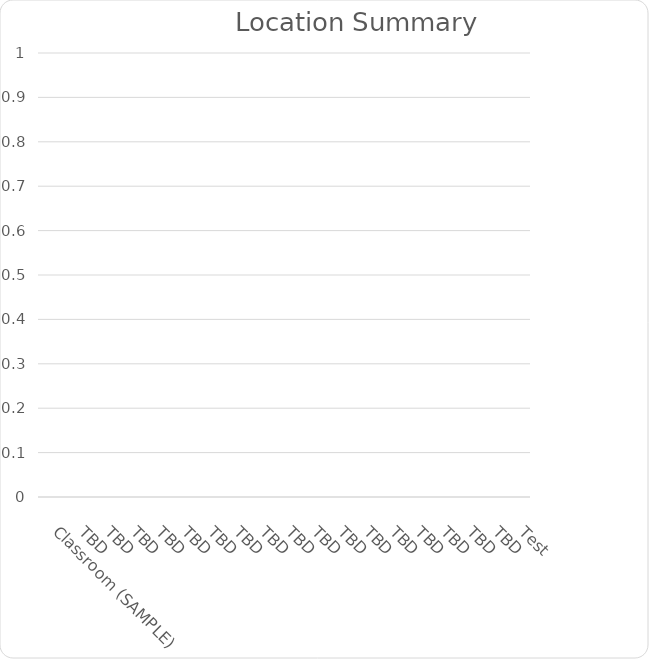
| Category | Series 4 | Series 7 | Series 10 | Series 0 | Series 1 | Series 2 | Series 3 | Series 5 | Series 6 | Series 8 |
|---|---|---|---|---|---|---|---|---|---|---|
| Classroom (SAMPLE) | 0 | 0 | 0 | 0 | 0 | 0 | 0 | 0 | 0 | 0 |
| TBD | 0 | 0 | 0 | 0 | 0 | 0 | 0 | 0 | 0 | 0 |
| TBD | 0 | 0 | 0 | 0 | 0 | 0 | 0 | 0 | 0 | 0 |
| TBD | 0 | 0 | 0 | 0 | 0 | 0 | 0 | 0 | 0 | 0 |
| TBD | 0 | 0 | 0 | 0 | 0 | 0 | 0 | 0 | 0 | 0 |
| TBD | 0 | 0 | 0 | 0 | 0 | 0 | 0 | 0 | 0 | 0 |
| TBD | 0 | 0 | 0 | 0 | 0 | 0 | 0 | 0 | 0 | 0 |
| TBD | 0 | 0 | 0 | 0 | 0 | 0 | 0 | 0 | 0 | 0 |
| TBD | 0 | 0 | 0 | 0 | 0 | 0 | 0 | 0 | 0 | 0 |
| TBD | 0 | 0 | 0 | 0 | 0 | 0 | 0 | 0 | 0 | 0 |
| TBD | 0 | 0 | 0 | 0 | 0 | 0 | 0 | 0 | 0 | 0 |
| TBD | 0 | 0 | 0 | 0 | 0 | 0 | 0 | 0 | 0 | 0 |
| TBD | 0 | 0 | 0 | 0 | 0 | 0 | 0 | 0 | 0 | 0 |
| TBD | 0 | 0 | 0 | 0 | 0 | 0 | 0 | 0 | 0 | 0 |
| TBD | 0 | 0 | 0 | 0 | 0 | 0 | 0 | 0 | 0 | 0 |
| TBD | 0 | 0 | 0 | 0 | 0 | 0 | 0 | 0 | 0 | 0 |
| TBD | 0 | 0 | 0 | 0 | 0 | 0 | 0 | 0 | 0 | 0 |
| TBD | 0 | 0 | 0 | 0 | 0 | 0 | 0 | 0 | 0 | 0 |
| Test | 0 | 0 | 0 | 0 | 0 | 0 | 0 | 0 | 0 | 0 |